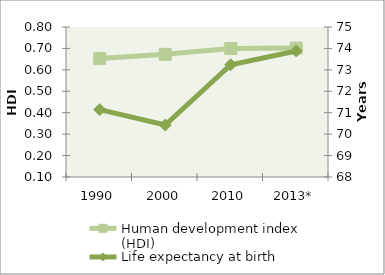
| Category | Human development index (HDI) |
|---|---|
| 1990 | 0.653 |
| 2000 | 0.672 |
| 2010 | 0.7 |
| 2013* | 0.702 |